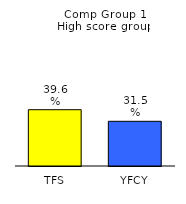
| Category | Series 0 |
|---|---|
| TFS | 0.396 |
| YFCY | 0.315 |